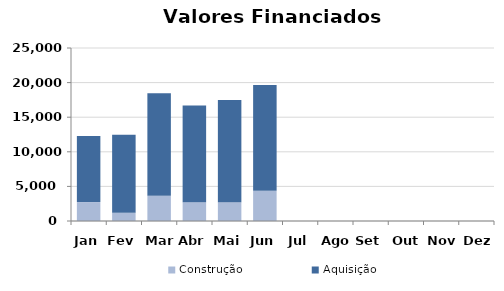
| Category | Construção | Aquisição  |
|---|---|---|
| Jan | 2736.443 | 9550.699 |
| Fev | 1204.78 | 11256.207 |
| Mar | 3647.063 | 14822.155 |
| Abr | 2716.578 | 13979.194 |
| Mai | 2722.144 | 14749.532 |
| Jun | 4362.743 | 15299.263 |
| Jul | 0 | 0 |
| Ago | 0 | 0 |
| Set | 0 | 0 |
| Out | 0 | 0 |
| Nov | 0 | 0 |
| Dez | 0 | 0 |